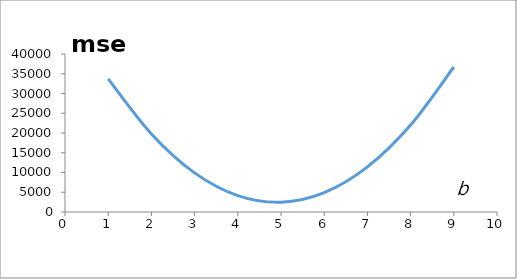
| Category | mse |
|---|---|
| 1.0 | 33690.9 |
| 2.0 | 19750.1 |
| 3.0 | 9900.1 |
| 4.0 | 4140.9 |
| 5.0 | 2472.5 |
| 6.0 | 4894.9 |
| 7.0 | 11408.1 |
| 8.0 | 22012.1 |
| 9.0 | 36706.9 |